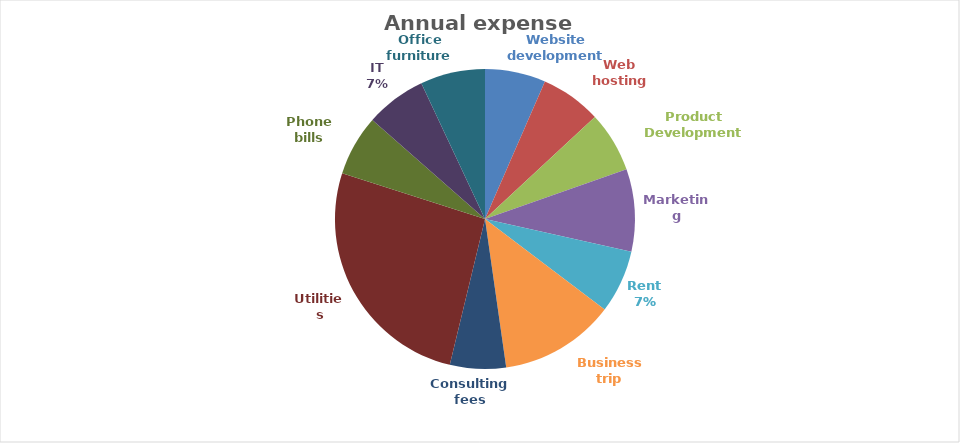
| Category | Series 0 |
|---|---|
| Website development | 0.065 |
| Web hosting | 0.065 |
| Product Development | 0.065 |
| Marketing | 0.089 |
| Rent | 0.068 |
| Business trip | 0.124 |
| Consulting fees | 0.06 |
| Utilities | 0.262 |
| Phone bills | 0.065 |
| IT | 0.065 |
| Office furniture | 0.07 |